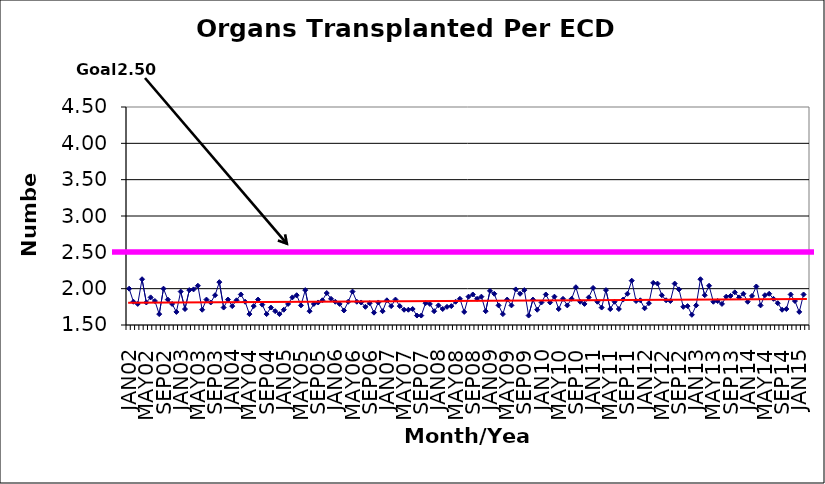
| Category | Series 0 |
|---|---|
| JAN02 | 2 |
| FEB02 | 1.82 |
| MAR02 | 1.79 |
| APR02 | 2.13 |
| MAY02 | 1.81 |
| JUN02 | 1.88 |
| JUL02 | 1.83 |
| AUG02 | 1.65 |
| SEP02 | 2 |
| OCT02 | 1.85 |
| NOV02 | 1.79 |
| DEC02 | 1.68 |
| JAN03 | 1.96 |
| FEB03 | 1.72 |
| MAR03 | 1.98 |
| APR03 | 1.99 |
| MAY03 | 2.04 |
| JUN03 | 1.71 |
| JUL03 | 1.85 |
| AUG03 | 1.81 |
| SEP03 | 1.91 |
| OCT03 | 2.09 |
| NOV03 | 1.74 |
| DEC03 | 1.85 |
| JAN04 | 1.76 |
| FEB04 | 1.84 |
| MAR04 | 1.92 |
| APR04 | 1.82 |
| MAY04 | 1.65 |
| JUN04 | 1.76 |
| JUL04 | 1.85 |
| AUG04 | 1.78 |
| SEP04 | 1.65 |
| OCT04 | 1.74 |
| NOV04 | 1.69 |
| DEC04 | 1.65 |
| JAN05 | 1.71 |
| FEB05 | 1.79 |
| MAR05 | 1.88 |
| APR05 | 1.91 |
| MAY05 | 1.77 |
| JUN05 | 1.98 |
| JUL05 | 1.69 |
| AUG05 | 1.79 |
| SEP05 | 1.81 |
| OCT05 | 1.84 |
| NOV05 | 1.94 |
| DEC05 | 1.86 |
| JAN06 | 1.82 |
| FEB06 | 1.79 |
| MAR06 | 1.7 |
| APR06 | 1.82 |
| MAY06 | 1.96 |
| JUN06 | 1.82 |
| JUL06 | 1.81 |
| AUG06 | 1.75 |
| SEP06 | 1.8 |
| OCT06 | 1.67 |
| NOV06 | 1.81 |
| DEC06 | 1.69 |
| JAN07 | 1.84 |
| FEB07 | 1.76 |
| MAR07 | 1.85 |
| APR07 | 1.76 |
| MAY07 | 1.71 |
| JUN07 | 1.71 |
| JUL07 | 1.72 |
| AUG07 | 1.63 |
| SEP07 | 1.63 |
| OCT07 | 1.8 |
| NOV07 | 1.79 |
| DEC07 | 1.69 |
| JAN08 | 1.77 |
| FEB08 | 1.72 |
| MAR08 | 1.75 |
| APR08 | 1.76 |
| MAY08 | 1.82 |
| JUN08 | 1.86 |
| JUL08 | 1.68 |
| AUG08 | 1.89 |
| SEP08 | 1.92 |
| OCT08 | 1.86 |
| NOV08 | 1.89 |
| DEC08 | 1.69 |
| JAN09 | 1.97 |
| FEB09 | 1.93 |
| MAR09 | 1.77 |
| APR09 | 1.65 |
| MAY09 | 1.85 |
| JUN09 | 1.77 |
| JUL09 | 1.99 |
| AUG09 | 1.93 |
| SEP09 | 1.98 |
| OCT09 | 1.63 |
| NOV09 | 1.85 |
| DEC09 | 1.71 |
| JAN10 | 1.81 |
| FEB10 | 1.92 |
| MAR10 | 1.81 |
| APR10 | 1.89 |
| MAY10 | 1.72 |
| JUN10 | 1.86 |
| JUL10 | 1.77 |
| AUG10 | 1.86 |
| SEP10 | 2.02 |
| OCT10 | 1.82 |
| NOV10 | 1.79 |
| DEC10 | 1.88 |
| JAN11 | 2.01 |
| FEB11 | 1.82 |
| MAR11 | 1.74 |
| APR11 | 1.98 |
| MAY11 | 1.72 |
| JUN11 | 1.82 |
| JUL11 | 1.72 |
| AUG11 | 1.85 |
| SEP11 | 1.93 |
| OCT11 | 2.11 |
| NOV11 | 1.83 |
| DEC11 | 1.84 |
| JAN12 | 1.73 |
| FEB12 | 1.8 |
| MAR12 | 2.08 |
| APR12 | 2.07 |
| MAY12 | 1.91 |
| JUN12 | 1.84 |
| JUL12 | 1.83 |
| AUG12 | 2.07 |
| SEP12 | 1.99 |
| OCT12 | 1.75 |
| NOV12 | 1.76 |
| DEC12 | 1.64 |
| JAN13 | 1.77 |
| FEB13 | 2.13 |
| MAR13 | 1.91 |
| APR13 | 2.04 |
| MAY13 | 1.82 |
| JUN13 | 1.83 |
| JUL13 | 1.79 |
| AUG13 | 1.89 |
| SEP13 | 1.9 |
| OCT13 | 1.95 |
| NOV13 | 1.88 |
| DEC13 | 1.93 |
| JAN14 | 1.82 |
| FEB14 | 1.9 |
| MAR14 | 2.03 |
| APR14 | 1.77 |
| MAY14 | 1.91 |
| JUN14 | 1.93 |
| JUL14 | 1.86 |
| AUG14 | 1.8 |
| SEP14 | 1.71 |
| OCT14 | 1.72 |
| NOV14 | 1.92 |
| DEC14 | 1.83 |
| JAN15 | 1.68 |
| FEB15 | 1.92 |